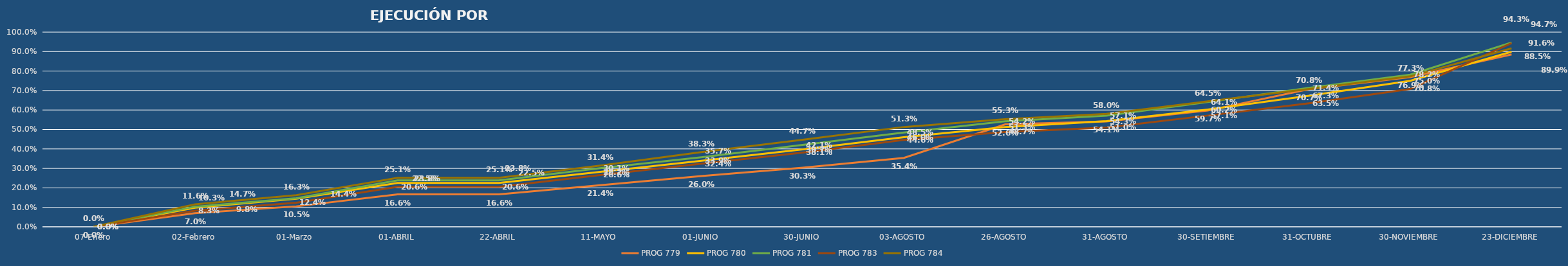
| Category | PROG 779 | PROG 780 | PROG 781 | PROG 783 | PROG 784 |
|---|---|---|---|---|---|
| 07-Enero | 0 | 0 | 0 | 0 | 0 |
| 02-Febrero | 0.07 | 0.098 | 0.103 | 0.083 | 0.116 |
| 01-Marzo | 0.105 | 0.144 | 0.147 | 0.124 | 0.163 |
| 01-ABRIL | 0.166 | 0.225 | 0.238 | 0.206 | 0.251 |
| 22-ABRIL | 0.166 | 0.225 | 0.238 | 0.206 | 0.251 |
| 11-MAYO | 0.214 | 0.282 | 0.301 | 0.266 | 0.314 |
| 01-JUNIO | 0.26 | 0.339 | 0.357 | 0.324 | 0.383 |
| 30-JUNIO | 0.303 | 0.397 | 0.421 | 0.381 | 0.447 |
| 03-AGOSTO | 0.354 | 0.46 | 0.485 | 0.446 | 0.513 |
| 26-AGOSTO | 0.526 | 0.513 | 0.542 | 0.487 | 0.553 |
| 31-AGOSTO | 0.541 | 0.543 | 0.571 | 0.51 | 0.58 |
| 30-SETIEMBRE | 0.597 | 0.602 | 0.641 | 0.571 | 0.645 |
| 31-OCTUBRE | 0.707 | 0.673 | 0.714 | 0.635 | 0.708 |
| 30-NOVIEMBRE | 0.769 | 0.75 | 0.782 | 0.708 | 0.773 |
| 23-DICIEMBRE | 0.885 | 0.899 | 0.947 | 0.943 | 0.916 |